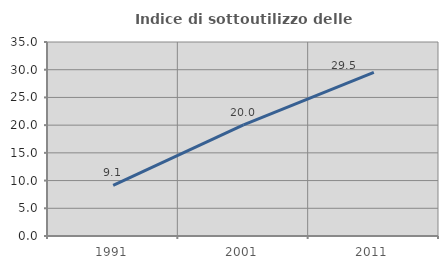
| Category | Indice di sottoutilizzo delle abitazioni  |
|---|---|
| 1991.0 | 9.121 |
| 2001.0 | 20.038 |
| 2011.0 | 29.526 |